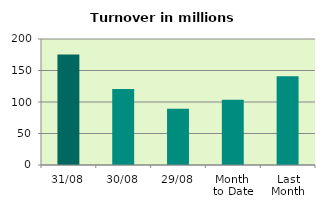
| Category | Series 0 |
|---|---|
| 31/08 | 175.405 |
| 30/08 | 120.789 |
| 29/08 | 89.096 |
| Month 
to Date | 103.765 |
| Last
Month | 140.832 |